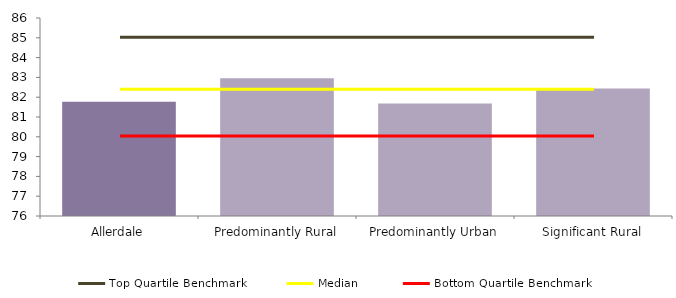
| Category | Series 0 |
|---|---|
| Allerdale | 81.775 |
| Predominantly Rural | 82.963 |
| Predominantly Urban | 81.678 |
| Significant Rural | 82.445 |